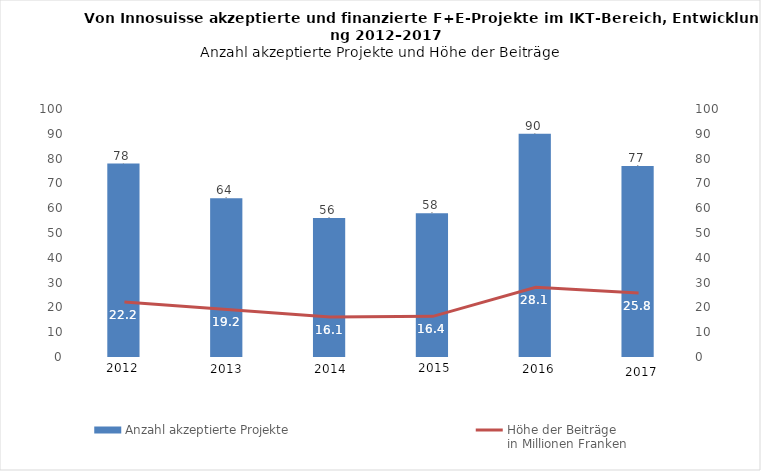
| Category | Anzahl akzeptierte Projekte  |
|---|---|
| 2012.0 | 78 |
| 2013.0 | 64 |
| 2014.0 | 56 |
| 2015.0 | 58 |
| 2016.0 | 90 |
| 2017.0 | 77 |